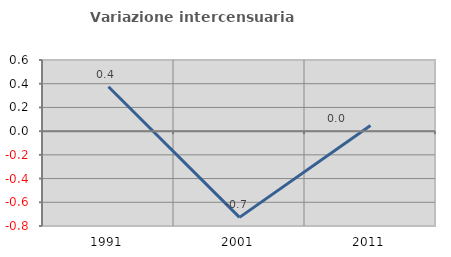
| Category | Variazione intercensuaria annua |
|---|---|
| 1991.0 | 0.374 |
| 2001.0 | -0.727 |
| 2011.0 | 0.047 |